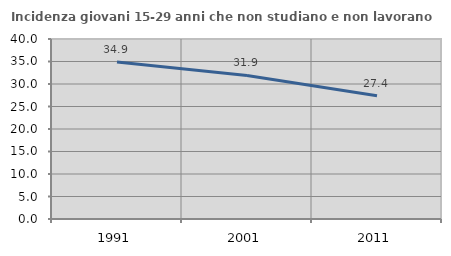
| Category | Incidenza giovani 15-29 anni che non studiano e non lavorano  |
|---|---|
| 1991.0 | 34.877 |
| 2001.0 | 31.897 |
| 2011.0 | 27.397 |